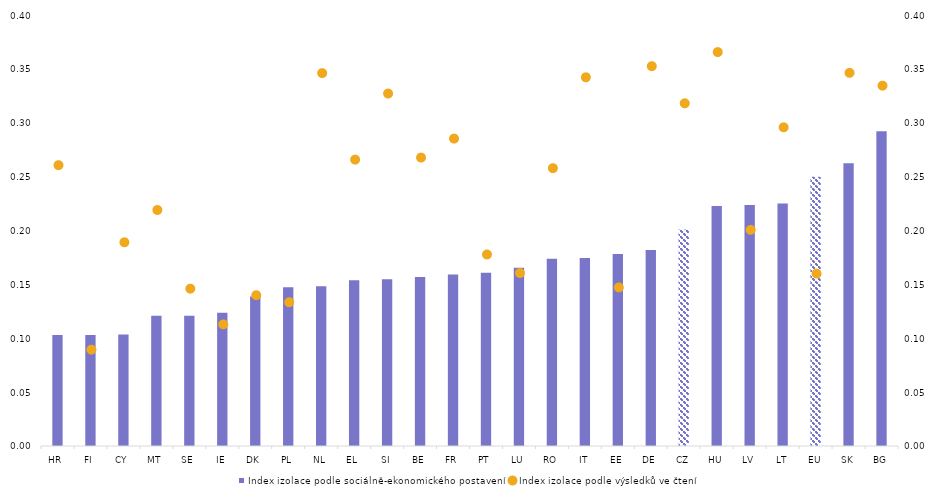
| Category | Index izolace podle sociálně-ekonomického postavení |
|---|---|
| HR | 0.103 |
| FI | 0.103 |
| CY | 0.103 |
| MT | 0.121 |
| SE | 0.121 |
| IE | 0.124 |
| DK | 0.139 |
| PL | 0.147 |
| NL | 0.148 |
| EL | 0.154 |
| SI | 0.155 |
| BE | 0.157 |
| FR | 0.159 |
| PT | 0.161 |
| LU | 0.165 |
| RO | 0.174 |
| IT | 0.175 |
| EE | 0.178 |
| DE | 0.182 |
| CZ | 0.201 |
| HU | 0.223 |
| LV | 0.224 |
| LT | 0.225 |
| EU | 0.25 |
| SK | 0.262 |
| BG | 0.292 |